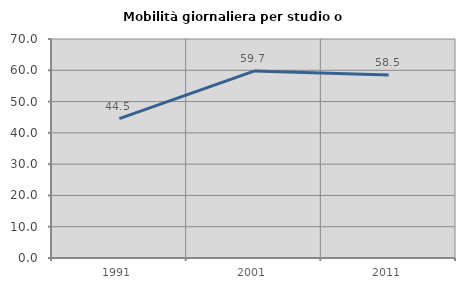
| Category | Mobilità giornaliera per studio o lavoro |
|---|---|
| 1991.0 | 44.55 |
| 2001.0 | 59.735 |
| 2011.0 | 58.468 |